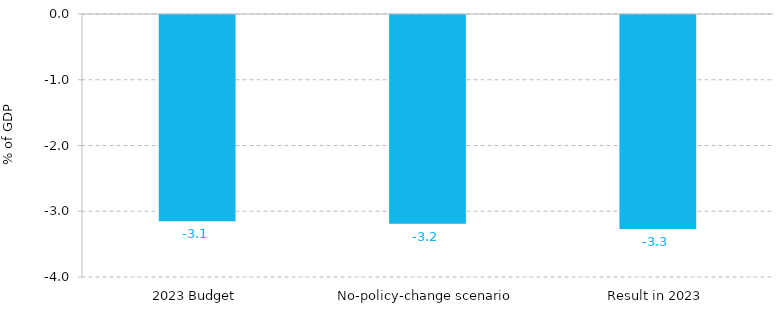
| Category | Structural balance |
|---|---|
| 2023 Budget | -3.136 |
| No-policy-change scenario | -3.173 |
| Result in 2023 | -3.255 |